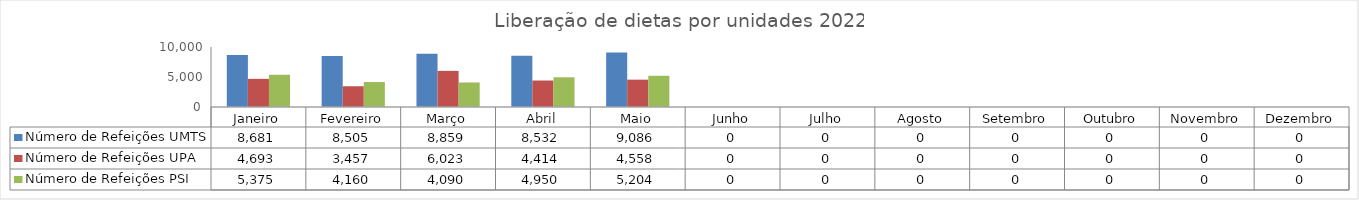
| Category | Número de Refeições UMTS | Número de Refeições UPA | Número de Refeições PSI |
|---|---|---|---|
| Janeiro | 8681 | 4693 | 5375 |
| Fevereiro | 8505 | 3457 | 4160 |
| Março | 8859 | 6023 | 4090 |
| Abril | 8532 | 4414 | 4950 |
| Maio | 9086 | 4558 | 5204 |
| Junho | 0 | 0 | 0 |
| Julho | 0 | 0 | 0 |
| Agosto | 0 | 0 | 0 |
| Setembro | 0 | 0 | 0 |
| Outubro | 0 | 0 | 0 |
| Novembro | 0 | 0 | 0 |
| Dezembro | 0 | 0 | 0 |